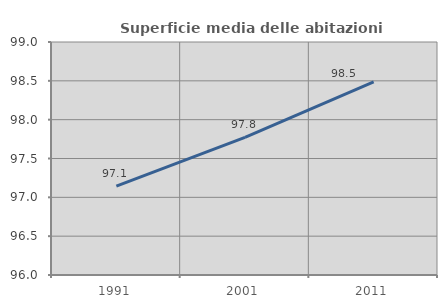
| Category | Superficie media delle abitazioni occupate |
|---|---|
| 1991.0 | 97.144 |
| 2001.0 | 97.772 |
| 2011.0 | 98.487 |